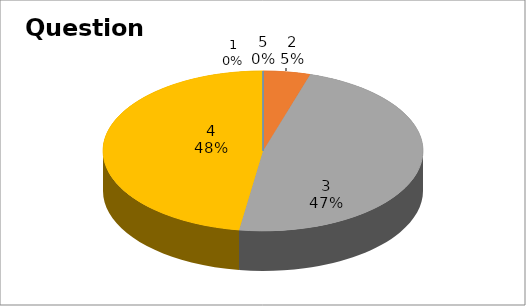
| Category | Series 0 |
|---|---|
| 0 | 0 |
| 1 | 1 |
| 2 | 10 |
| 3 | 10 |
| 4 | 0 |